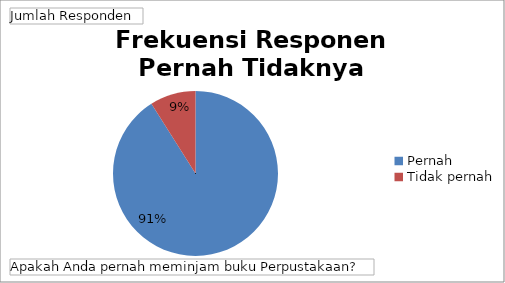
| Category | Total |
|---|---|
| Pernah | 71 |
| Tidak pernah | 7 |